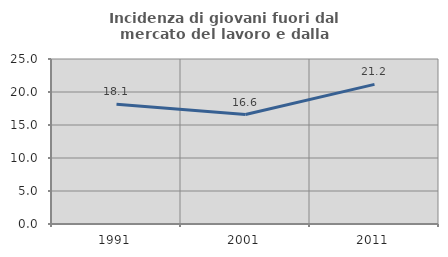
| Category | Incidenza di giovani fuori dal mercato del lavoro e dalla formazione  |
|---|---|
| 1991.0 | 18.126 |
| 2001.0 | 16.584 |
| 2011.0 | 21.157 |